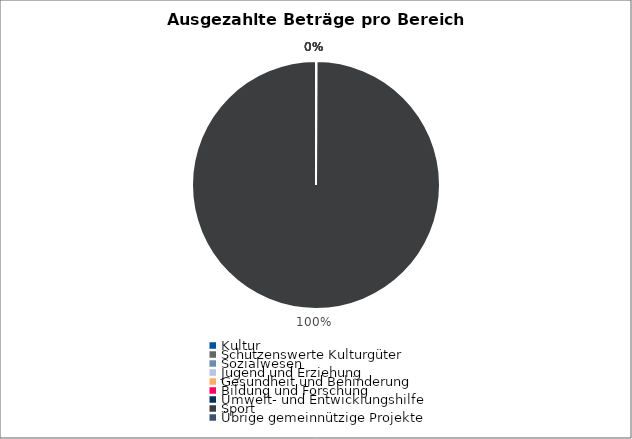
| Category | Series 0 |
|---|---|
| Kultur | 0 |
| Schützenswerte Kulturgüter | 0 |
| Sozialwesen | 0 |
| Jugend und Erziehung | 0 |
| Gesundheit und Behinderung | 0 |
| Bildung und Forschung | 0 |
| Umwelt- und Entwicklungshilfe | 0 |
| Sport | 3138295 |
| Übrige gemeinnützige Projekte | 0 |